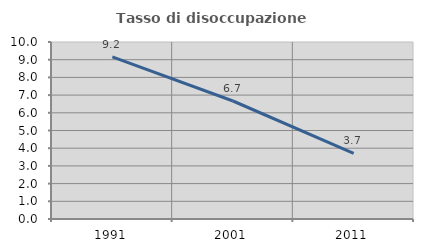
| Category | Tasso di disoccupazione giovanile  |
|---|---|
| 1991.0 | 9.16 |
| 2001.0 | 6.667 |
| 2011.0 | 3.704 |